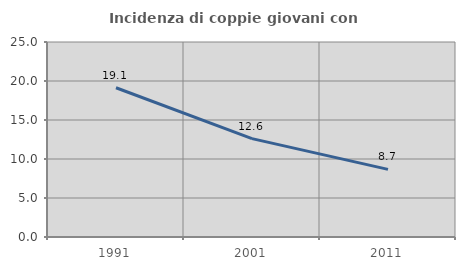
| Category | Incidenza di coppie giovani con figli |
|---|---|
| 1991.0 | 19.135 |
| 2001.0 | 12.613 |
| 2011.0 | 8.672 |